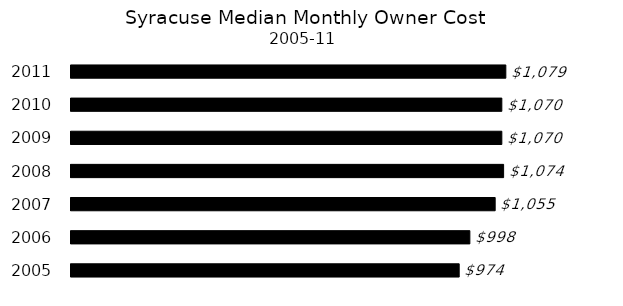
| Category | Series 0 |
|---|---|
| 2005 | 974 |
| 2006 | 998 |
| 2007 | 1055 |
| 2008 | 1074 |
| 2009 | 1070 |
| 2010 | 1070 |
| 2011 | 1079 |